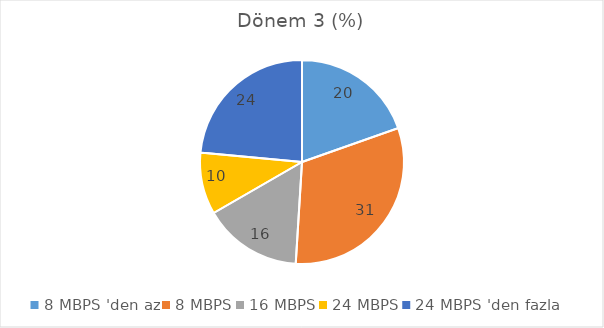
| Category | Dönem 3 (%) |
|---|---|
| 8 MBPS 'den az | 19.608 |
| 8 MBPS | 31.373 |
| 16 MBPS | 15.686 |
| 24 MBPS | 9.804 |
| 24 MBPS 'den fazla | 23.529 |